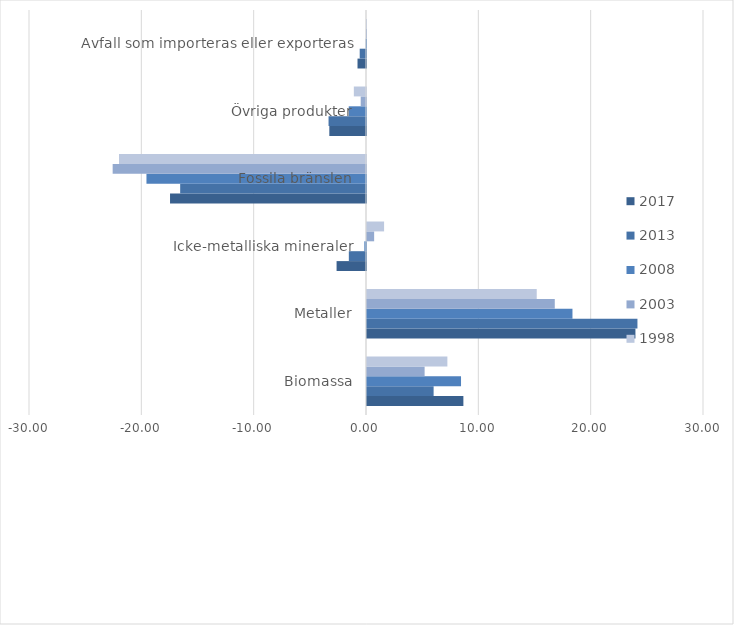
| Category | 2017 | 2013 | 2008 | 2003 | 1998 |
|---|---|---|---|---|---|
| Biomassa | 8.58 | 5.93 | 8.37 | 5.129 | 7.155 |
| Metaller | 23.896 | 24.076 | 18.291 | 16.716 | 15.11 |
| Icke-metalliska mineraler | -2.619 | -1.529 | -0.148 | 0.636 | 1.521 |
| Fossila bränslen | -17.445 | -16.543 | -19.543 | -22.552 | -21.988 |
| Övriga produkter | -3.265 | -3.334 | -1.537 | -0.472 | -1.083 |
| Avfall som importeras eller exporteras | -0.756 | -0.56 | -0.027 | -0.002 | 0 |